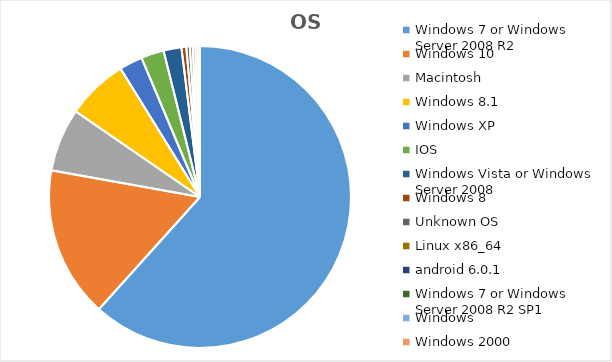
| Category | Series 0 |
|---|---|
| Windows 7 or Windows Server 2008 R2 | 1242699 |
| Windows 10 | 325630 |
| Macintosh | 136533 |
| Windows 8.1 | 132424 |
| Windows XP | 50343 |
| IOS | 49156 |
| Windows Vista or Windows Server 2008 | 38659 |
| Windows 8 | 10360 |
| Unknown OS | 7542 |
| Linux x86_64 | 6175 |
| android 6.0.1 | 5400 |
| Windows 7 or Windows Server 2008 R2 SP1 | 4910 |
| Windows | 3262 |
| Windows 2000 | 2057 |